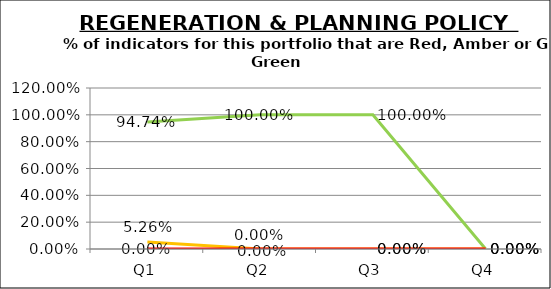
| Category | Green | Amber | Red |
|---|---|---|---|
| Q1 | 0.947 | 0.053 | 0 |
| Q2 | 1 | 0 | 0 |
| Q3 | 1 | 0 | 0 |
| Q4 | 0 | 0 | 0 |